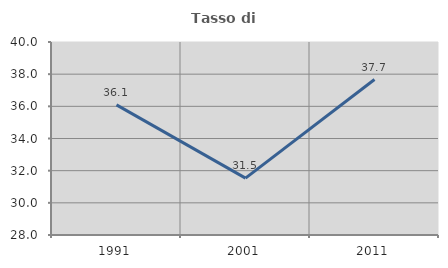
| Category | Tasso di occupazione   |
|---|---|
| 1991.0 | 36.09 |
| 2001.0 | 31.535 |
| 2011.0 | 37.668 |